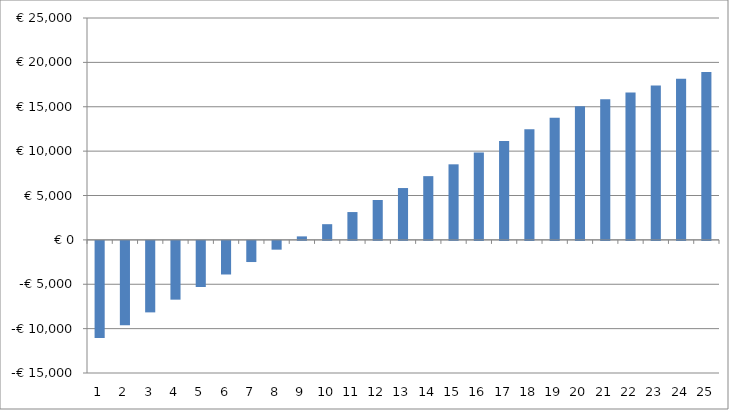
| Category | Series 0 |
|---|---|
| 0 | -10748.6 |
| 1 | -9061.483 |
| 2 | -7380.247 |
| 3 | -5704.607 |
| 4 | -4034.275 |
| 5 | -2368.965 |
| 6 | -708.383 |
| 7 | 947.763 |
| 8 | 2599.768 |
| 9 | 4247.932 |
| 10 | 5892.554 |
| 11 | 7533.939 |
| 12 | 9172.392 |
| 13 | 10808.222 |
| 14 | 12441.741 |
| 15 | 14073.264 |
| 16 | 15703.107 |
| 17 | 17331.593 |
| 18 | 18959.045 |
| 19 | 20585.791 |
| 20 | 21459.719 |
| 21 | 22327.968 |
| 22 | 23190.677 |
| 23 | 24047.988 |
| 24 | 24900.042 |